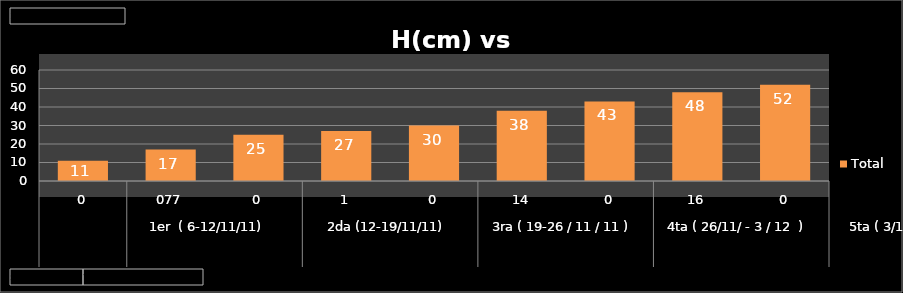
| Category | Total |
|---|---|
| 0 | 11 |
| 1 | 17 |
| 2 | 25 |
| 3 | 27 |
| 4 | 30 |
| 5 | 38 |
| 6 | 43 |
| 7 | 48 |
| 8 | 52 |